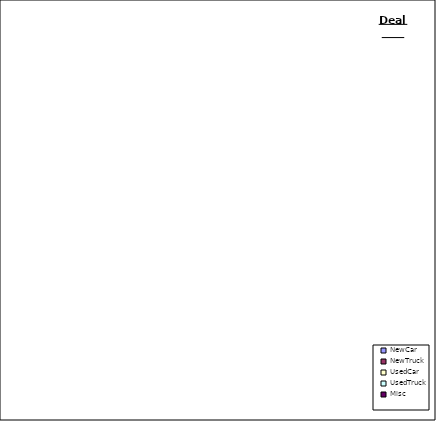
| Category | Deal Mix |
|---|---|
| NewCar | 0 |
| NewTruck | 0 |
| UsedCar | 0 |
| UsedTruck | 0 |
| Misc | 0 |